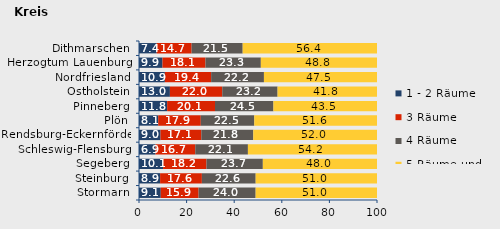
| Category | 1 - 2 Räume | 3 Räume | 4 Räume | 5 Räume und mehr |
|---|---|---|---|---|
| Stormarn | 9.138 | 15.898 | 23.974 | 50.99 |
| Steinburg | 8.869 | 17.554 | 22.601 | 50.976 |
| Segeberg | 10.105 | 18.242 | 23.688 | 47.965 |
| Schleswig-Flensburg | 6.943 | 16.697 | 22.124 | 54.236 |
| Rendsburg-Eckernförde | 9.046 | 17.141 | 21.834 | 51.98 |
| Plön | 8.067 | 17.897 | 22.474 | 51.561 |
| Pinneberg | 11.822 | 20.111 | 24.548 | 43.518 |
| Ostholstein | 12.984 | 21.997 | 23.242 | 41.777 |
| Nordfriesland | 10.872 | 19.436 | 22.188 | 47.504 |
| Herzogtum Lauenburg | 9.864 | 18.06 | 23.269 | 48.807 |
| Dithmarschen | 7.443 | 14.663 | 21.46 | 56.435 |